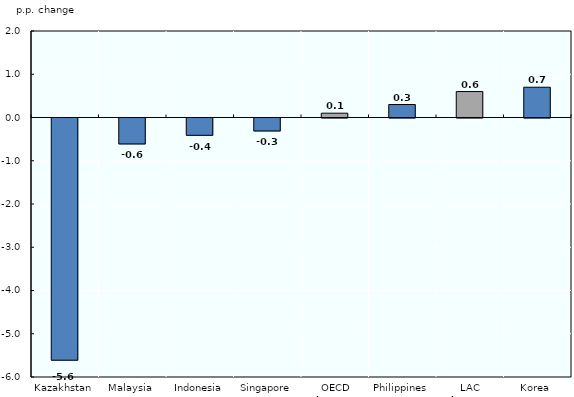
| Category | Change in 2015 (Percentage points of GDP) |
|---|---|
| Kazakhstan | -5.6 |
| Malaysia | -0.6 |
| Indonesia | -0.4 |
| Singapore | -0.3 |
| OECD Average | 0.1 |
| Philippines | 0.3 |
| LAC Average | 0.6 |
| Korea | 0.7 |